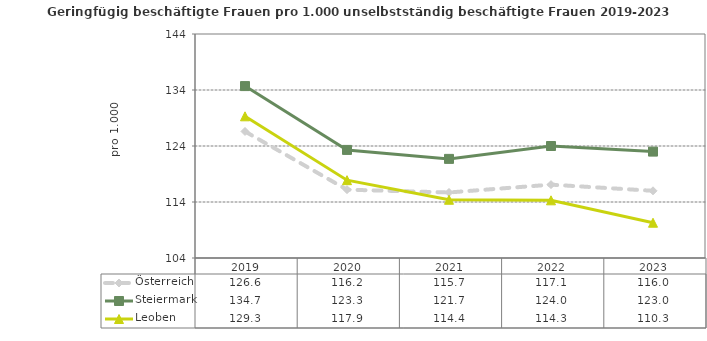
| Category | Österreich | Steiermark | Leoben |
|---|---|---|---|
| 2023.0 | 116 | 123 | 110.3 |
| 2022.0 | 117.1 | 124 | 114.3 |
| 2021.0 | 115.7 | 121.7 | 114.4 |
| 2020.0 | 116.2 | 123.3 | 117.9 |
| 2019.0 | 126.6 | 134.7 | 129.3 |